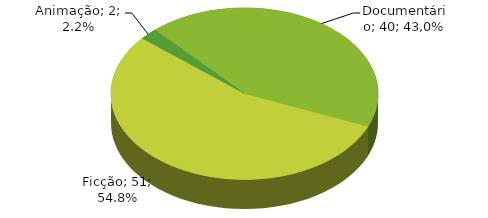
| Category | Quantidade Obras |
|---|---|
| Animação | 2 |
| Documentário | 40 |
| Ficção | 51 |